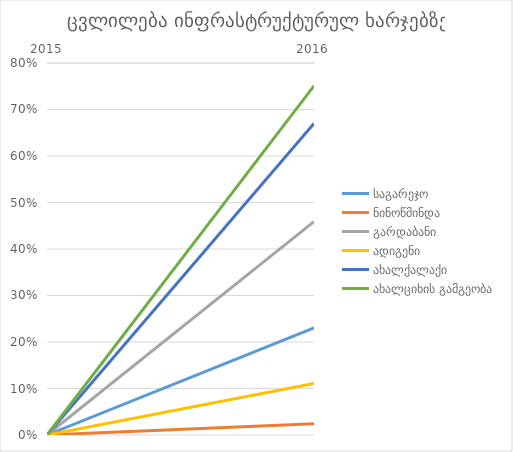
| Category | საგარეჯო | ნინოწმინდა | გარდაბანი | ადიგენი | ახალქალაქი | ახალციხის გამგეობა |
|---|---|---|---|---|---|---|
| 2015.0 | 0 | 0 | 0 | 0 | 0 | 0 |
| 2016.0 | 0.23 | 0.024 | 0.459 | 0.111 | 0.67 | 0.751 |